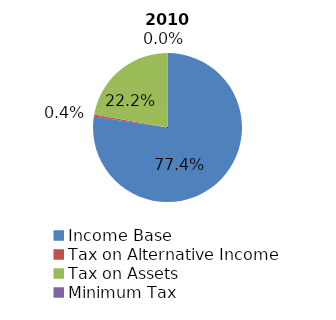
| Category | 2010 |
|---|---|
| Income Base | 690685002 |
| Tax on Alternative Income  | 3680119 |
| Tax on Assets | 198376294 |
| Minimum Tax | 66750 |